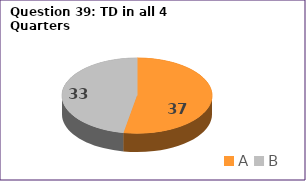
| Category | Series 0 |
|---|---|
| A | 37 |
| B | 33 |